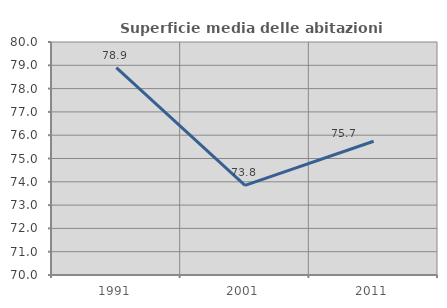
| Category | Superficie media delle abitazioni occupate |
|---|---|
| 1991.0 | 78.903 |
| 2001.0 | 73.847 |
| 2011.0 | 75.739 |